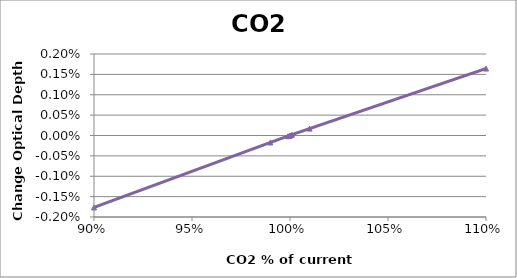
| Category | Series 3 |
|---|---|
| 0.9 | -0.002 |
| 0.99 | 0 |
| 0.999 | 0 |
| 0.9999 | 0 |
| 1.0001 | 0 |
| 1.001 | 0 |
| 1.01 | 0 |
| 1.1 | 0.002 |